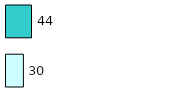
| Category | Series 0 | Series 1 |
|---|---|---|
| 0 | 30 | 44 |